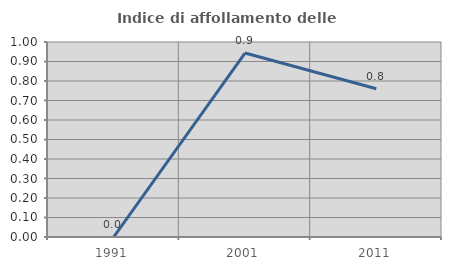
| Category | Indice di affollamento delle abitazioni  |
|---|---|
| 1991.0 | 0 |
| 2001.0 | 0.943 |
| 2011.0 | 0.76 |